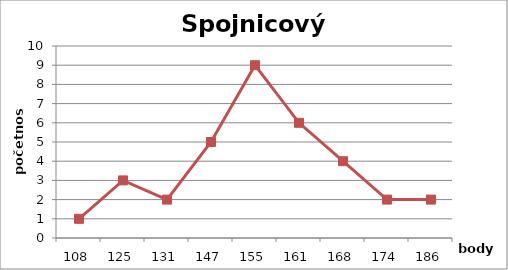
| Category | Series 1 |
|---|---|
| 108.0 | 1 |
| 125.0 | 3 |
| 131.0 | 2 |
| 147.0 | 5 |
| 155.0 | 9 |
| 161.0 | 6 |
| 168.0 | 4 |
| 174.0 | 2 |
| 186.0 | 2 |